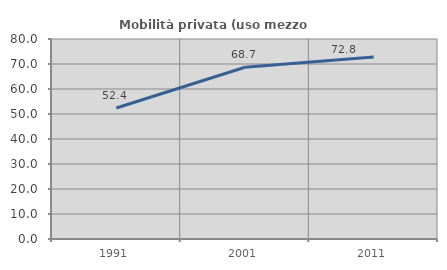
| Category | Mobilità privata (uso mezzo privato) |
|---|---|
| 1991.0 | 52.41 |
| 2001.0 | 68.71 |
| 2011.0 | 72.826 |